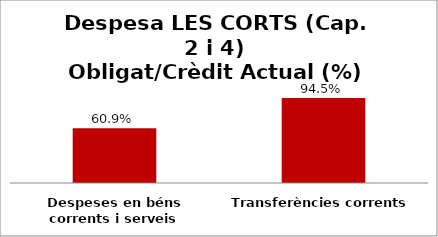
| Category | Series 0 |
|---|---|
| Despeses en béns corrents i serveis | 0.609 |
| Transferències corrents | 0.945 |